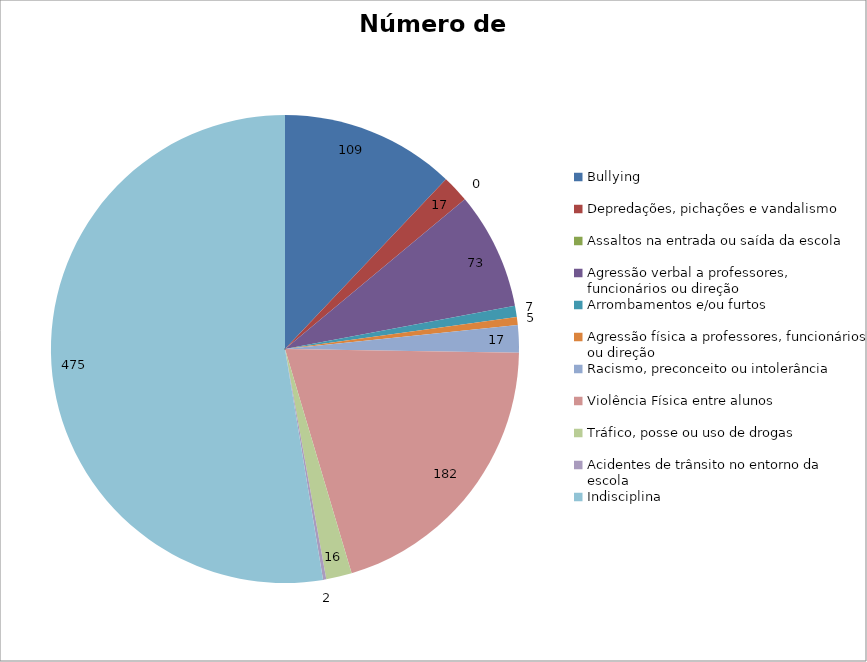
| Category | Número de Casos |
|---|---|
| Bullying | 109 |
| Depredações, pichações e vandalismo | 17 |
| Assaltos na entrada ou saída da escola | 0 |
| Agressão verbal a professores, funcionários ou direção | 73 |
| Arrombamentos e/ou furtos | 7 |
| Agressão física a professores, funcionários ou direção | 5 |
| Racismo, preconceito ou intolerância | 17 |
| Violência Física entre alunos | 182 |
| Tráfico, posse ou uso de drogas | 16 |
| Acidentes de trânsito no entorno da escola | 2 |
| Indisciplina | 475 |